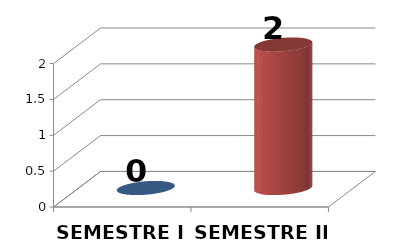
| Category | SEMESTRE I SEMESTRE II |
|---|---|
| SEMESTRE I | 0 |
| SEMESTRE II | 2 |